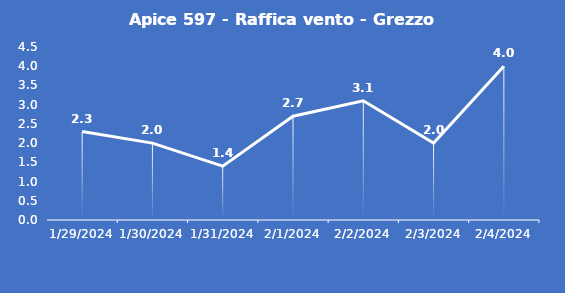
| Category | Apice 597 - Raffica vento - Grezzo (m/s) |
|---|---|
| 1/29/24 | 2.3 |
| 1/30/24 | 2 |
| 1/31/24 | 1.4 |
| 2/1/24 | 2.7 |
| 2/2/24 | 3.1 |
| 2/3/24 | 2 |
| 2/4/24 | 4 |